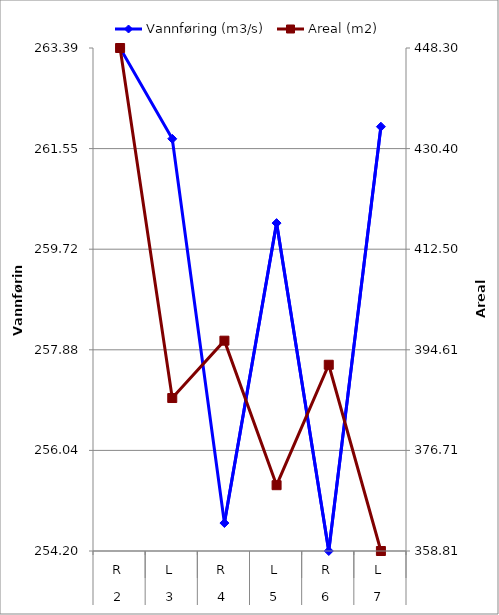
| Category | Vannføring (m3/s) |
|---|---|
| 0 | 263.393 |
| 1 | 261.734 |
| 2 | 254.711 |
| 3 | 260.193 |
| 4 | 254.2 |
| 5 | 261.955 |